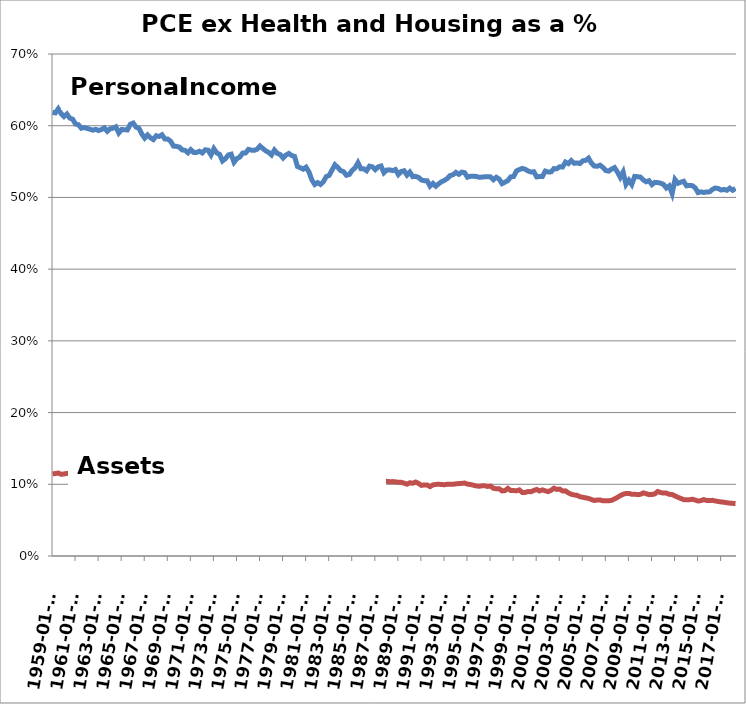
| Category | Series 0 | Series 1 |
|---|---|---|
| 1959-01-01 | 0.619 | 0.115 |
| 1959-04-01 | 0.618 | 0.115 |
| 1959-07-01 | 0.624 | 0.116 |
| 1959-10-01 | 0.617 | 0.114 |
| 1960-01-01 | 0.613 | 0.114 |
| 1960-04-01 | 0.616 | 0.115 |
| 1960-07-01 | 0.611 | 0.115 |
| 1960-10-01 | 0.609 | 0.112 |
| 1961-01-01 | 0.602 | 0.109 |
| 1961-04-01 | 0.601 | 0.11 |
| 1961-07-01 | 0.596 | 0.109 |
| 1961-10-01 | 0.597 | 0.108 |
| 1962-01-01 | 0.596 | 0.109 |
| 1962-04-01 | 0.595 | 0.115 |
| 1962-07-01 | 0.594 | 0.113 |
| 1962-10-01 | 0.595 | 0.11 |
| 1963-01-01 | 0.593 | 0.109 |
| 1963-04-01 | 0.595 | 0.109 |
| 1963-07-01 | 0.597 | 0.109 |
| 1963-10-01 | 0.592 | 0.11 |
| 1964-01-01 | 0.596 | 0.111 |
| 1964-04-01 | 0.596 | 0.111 |
| 1964-07-01 | 0.598 | 0.111 |
| 1964-10-01 | 0.59 | 0.109 |
| 1965-01-01 | 0.595 | 0.111 |
| 1965-04-01 | 0.594 | 0.112 |
| 1965-07-01 | 0.594 | 0.112 |
| 1965-10-01 | 0.602 | 0.113 |
| 1966-01-01 | 0.604 | 0.115 |
| 1966-04-01 | 0.598 | 0.114 |
| 1966-07-01 | 0.596 | 0.117 |
| 1966-10-01 | 0.588 | 0.115 |
| 1967-01-01 | 0.583 | 0.112 |
| 1967-04-01 | 0.587 | 0.112 |
| 1967-07-01 | 0.583 | 0.111 |
| 1967-10-01 | 0.581 | 0.11 |
| 1968-01-01 | 0.586 | 0.113 |
| 1968-04-01 | 0.585 | 0.112 |
| 1968-07-01 | 0.587 | 0.113 |
| 1968-10-01 | 0.581 | 0.109 |
| 1969-01-01 | 0.581 | 0.111 |
| 1969-04-01 | 0.578 | 0.112 |
| 1969-07-01 | 0.572 | 0.113 |
| 1969-10-01 | 0.571 | 0.115 |
| 1970-01-01 | 0.57 | 0.116 |
| 1970-04-01 | 0.566 | 0.119 |
| 1970-07-01 | 0.566 | 0.117 |
| 1970-10-01 | 0.562 | 0.114 |
| 1971-01-01 | 0.567 | 0.113 |
| 1971-04-01 | 0.563 | 0.113 |
| 1971-07-01 | 0.563 | 0.113 |
| 1971-10-01 | 0.564 | 0.112 |
| 1972-01-01 | 0.562 | 0.111 |
| 1972-04-01 | 0.566 | 0.112 |
| 1972-07-01 | 0.566 | 0.112 |
| 1972-10-01 | 0.559 | 0.11 |
| 1973-01-01 | 0.568 | 0.113 |
| 1973-04-01 | 0.562 | 0.114 |
| 1973-07-01 | 0.56 | 0.112 |
| 1973-10-01 | 0.551 | 0.114 |
| 1974-01-01 | 0.554 | 0.116 |
| 1974-04-01 | 0.559 | 0.119 |
| 1974-07-01 | 0.56 | 0.123 |
| 1974-10-01 | 0.549 | 0.12 |
| 1975-01-01 | 0.554 | 0.118 |
| 1975-04-01 | 0.556 | 0.117 |
| 1975-07-01 | 0.562 | 0.121 |
| 1975-10-01 | 0.562 | 0.121 |
| 1976-01-01 | 0.567 | 0.121 |
| 1976-04-01 | 0.566 | 0.119 |
| 1976-07-01 | 0.566 | 0.12 |
| 1976-10-01 | 0.567 | 0.12 |
| 1977-01-01 | 0.572 | 0.121 |
| 1977-04-01 | 0.568 | 0.12 |
| 1977-07-01 | 0.565 | 0.12 |
| 1977-10-01 | 0.563 | 0.121 |
| 1978-01-01 | 0.559 | 0.12 |
| 1978-04-01 | 0.566 | 0.121 |
| 1978-07-01 | 0.562 | 0.12 |
| 1978-10-01 | 0.56 | 0.12 |
| 1979-01-01 | 0.555 | 0.118 |
| 1979-04-01 | 0.559 | 0.117 |
| 1979-07-01 | 0.561 | 0.117 |
| 1979-10-01 | 0.558 | 0.116 |
| 1980-01-01 | 0.557 | 0.117 |
| 1980-04-01 | 0.543 | 0.112 |
| 1980-07-01 | 0.541 | 0.111 |
| 1980-10-01 | 0.539 | 0.112 |
| 1981-01-01 | 0.542 | 0.113 |
| 1981-04-01 | 0.535 | 0.111 |
| 1981-07-01 | 0.524 | 0.112 |
| 1981-10-01 | 0.518 | 0.109 |
| 1982-01-01 | 0.521 | 0.11 |
| 1982-04-01 | 0.518 | 0.109 |
| 1982-07-01 | 0.522 | 0.11 |
| 1982-10-01 | 0.529 | 0.11 |
| 1983-01-01 | 0.531 | 0.109 |
| 1983-04-01 | 0.538 | 0.11 |
| 1983-07-01 | 0.545 | 0.112 |
| 1983-10-01 | 0.542 | 0.114 |
| 1984-01-01 | 0.537 | 0.114 |
| 1984-04-01 | 0.536 | 0.114 |
| 1984-07-01 | 0.531 | 0.113 |
| 1984-10-01 | 0.532 | 0.113 |
| 1985-01-01 | 0.538 | 0.113 |
| 1985-04-01 | 0.541 | 0.112 |
| 1985-07-01 | 0.548 | 0.113 |
| 1985-10-01 | 0.54 | 0.11 |
| 1986-01-01 | 0.54 | 0.109 |
| 1986-04-01 | 0.537 | 0.107 |
| 1986-07-01 | 0.544 | 0.108 |
| 1986-10-01 | 0.543 | 0.106 |
| 1987-01-01 | 0.539 | 0.103 |
| 1987-04-01 | 0.543 | 0.104 |
| 1987-07-01 | 0.544 | 0.103 |
| 1987-10-01 | 0.534 | 0.104 |
| 1988-01-01 | 0.538 | 0.104 |
| 1988-04-01 | 0.538 | 0.104 |
| 1988-07-01 | 0.537 | 0.104 |
| 1988-10-01 | 0.539 | 0.103 |
| 1989-01-01 | 0.532 | 0.103 |
| 1989-04-01 | 0.536 | 0.103 |
| 1989-07-01 | 0.537 | 0.102 |
| 1989-10-01 | 0.531 | 0.1 |
| 1990-01-01 | 0.535 | 0.102 |
| 1990-04-01 | 0.529 | 0.101 |
| 1990-07-01 | 0.529 | 0.103 |
| 1990-10-01 | 0.528 | 0.101 |
| 1991-01-01 | 0.524 | 0.098 |
| 1991-04-01 | 0.523 | 0.099 |
| 1991-07-01 | 0.523 | 0.099 |
| 1991-10-01 | 0.516 | 0.097 |
| 1992-01-01 | 0.52 | 0.099 |
| 1992-04-01 | 0.516 | 0.1 |
| 1992-07-01 | 0.519 | 0.1 |
| 1992-10-01 | 0.522 | 0.1 |
| 1993-01-01 | 0.524 | 0.099 |
| 1993-04-01 | 0.526 | 0.1 |
| 1993-07-01 | 0.531 | 0.1 |
| 1993-10-01 | 0.532 | 0.1 |
| 1994-01-01 | 0.535 | 0.101 |
| 1994-04-01 | 0.532 | 0.101 |
| 1994-07-01 | 0.535 | 0.101 |
| 1994-10-01 | 0.534 | 0.102 |
| 1995-01-01 | 0.528 | 0.1 |
| 1995-04-01 | 0.53 | 0.1 |
| 1995-07-01 | 0.529 | 0.099 |
| 1995-10-01 | 0.529 | 0.098 |
| 1996-01-01 | 0.528 | 0.097 |
| 1996-04-01 | 0.528 | 0.098 |
| 1996-07-01 | 0.529 | 0.098 |
| 1996-10-01 | 0.529 | 0.097 |
| 1997-01-01 | 0.529 | 0.098 |
| 1997-04-01 | 0.525 | 0.094 |
| 1997-07-01 | 0.528 | 0.094 |
| 1997-10-01 | 0.526 | 0.094 |
| 1998-01-01 | 0.519 | 0.091 |
| 1998-04-01 | 0.521 | 0.091 |
| 1998-07-01 | 0.523 | 0.094 |
| 1998-10-01 | 0.529 | 0.091 |
| 1999-01-01 | 0.529 | 0.091 |
| 1999-04-01 | 0.537 | 0.091 |
| 1999-07-01 | 0.539 | 0.092 |
| 1999-10-01 | 0.54 | 0.089 |
| 2000-01-01 | 0.539 | 0.089 |
| 2000-04-01 | 0.537 | 0.09 |
| 2000-07-01 | 0.535 | 0.09 |
| 2000-10-01 | 0.536 | 0.091 |
| 2001-01-01 | 0.529 | 0.093 |
| 2001-04-01 | 0.529 | 0.091 |
| 2001-07-01 | 0.529 | 0.092 |
| 2001-10-01 | 0.537 | 0.091 |
| 2002-01-01 | 0.535 | 0.09 |
| 2002-04-01 | 0.536 | 0.092 |
| 2002-07-01 | 0.54 | 0.095 |
| 2002-10-01 | 0.54 | 0.093 |
| 2003-01-01 | 0.543 | 0.093 |
| 2003-04-01 | 0.543 | 0.091 |
| 2003-07-01 | 0.549 | 0.091 |
| 2003-10-01 | 0.547 | 0.088 |
| 2004-01-01 | 0.551 | 0.086 |
| 2004-04-01 | 0.548 | 0.085 |
| 2004-07-01 | 0.548 | 0.085 |
| 2004-10-01 | 0.547 | 0.083 |
| 2005-01-01 | 0.551 | 0.082 |
| 2005-04-01 | 0.552 | 0.081 |
| 2005-07-01 | 0.555 | 0.08 |
| 2005-10-01 | 0.548 | 0.079 |
| 2006-01-01 | 0.544 | 0.077 |
| 2006-04-01 | 0.543 | 0.078 |
| 2006-07-01 | 0.545 | 0.078 |
| 2006-10-01 | 0.542 | 0.077 |
| 2007-01-01 | 0.537 | 0.077 |
| 2007-04-01 | 0.537 | 0.077 |
| 2007-07-01 | 0.54 | 0.078 |
| 2007-10-01 | 0.542 | 0.079 |
| 2008-01-01 | 0.536 | 0.082 |
| 2008-04-01 | 0.528 | 0.084 |
| 2008-07-01 | 0.535 | 0.086 |
| 2008-10-01 | 0.518 | 0.087 |
| 2009-01-01 | 0.524 | 0.087 |
| 2009-04-01 | 0.518 | 0.086 |
| 2009-07-01 | 0.529 | 0.086 |
| 2009-10-01 | 0.529 | 0.086 |
| 2010-01-01 | 0.528 | 0.086 |
| 2010-04-01 | 0.524 | 0.088 |
| 2010-07-01 | 0.522 | 0.087 |
| 2010-10-01 | 0.523 | 0.086 |
| 2011-01-01 | 0.518 | 0.086 |
| 2011-04-01 | 0.521 | 0.087 |
| 2011-07-01 | 0.521 | 0.09 |
| 2011-10-01 | 0.52 | 0.089 |
| 2012-01-01 | 0.518 | 0.088 |
| 2012-04-01 | 0.513 | 0.088 |
| 2012-07-01 | 0.516 | 0.086 |
| 2012-10-01 | 0.505 | 0.086 |
| 2013-01-01 | 0.525 | 0.084 |
| 2013-04-01 | 0.52 | 0.082 |
| 2013-07-01 | 0.521 | 0.08 |
| 2013-10-01 | 0.523 | 0.079 |
| 2014-01-01 | 0.516 | 0.078 |
| 2014-04-01 | 0.517 | 0.078 |
| 2014-07-01 | 0.516 | 0.079 |
| 2014-10-01 | 0.513 | 0.078 |
| 2015-01-01 | 0.507 | 0.077 |
| 2015-04-01 | 0.508 | 0.077 |
| 2015-07-01 | 0.507 | 0.079 |
| 2015-10-01 | 0.508 | 0.077 |
| 2016-01-01 | 0.508 | 0.077 |
| 2016-04-01 | 0.511 | 0.078 |
| 2016-07-01 | 0.513 | 0.077 |
| 2016-10-01 | 0.512 | 0.076 |
| 2017-01-01 | 0.51 | 0.075 |
| 2017-04-01 | 0.511 | 0.075 |
| 2017-07-01 | 0.51 | 0.074 |
| 2017-10-01 | 0.513 | 0.074 |
| 2018-01-01 | 0.51 | 0.073 |
| 2018-04-01 | 0.513 | 0.073 |